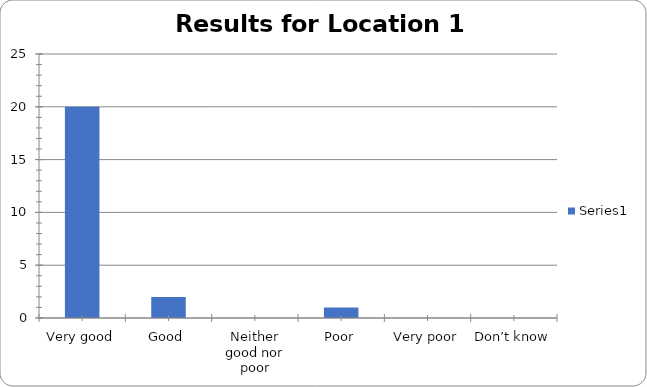
| Category | Series 0 |
|---|---|
| Very good | 20 |
| Good | 2 |
| Neither good nor poor | 0 |
| Poor | 1 |
| Very poor | 0 |
| Don’t know | 0 |